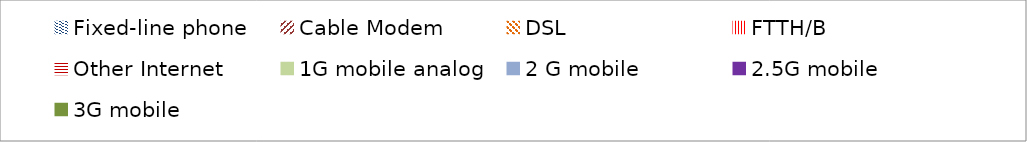
| Category | Series 0 |
|---|---|
| Fixed-line phone | 830942114 |
| Cable Modem | 7883544 |
| DSL | 6184042 |
| FTTH/B | 0 |
| Other Internet | 188336377 |
| 1G mobile analog  | 90392064 |
| 2 G mobile | 648365457 |
| 2.5G mobile | 0 |
| 3G mobile | 0 |